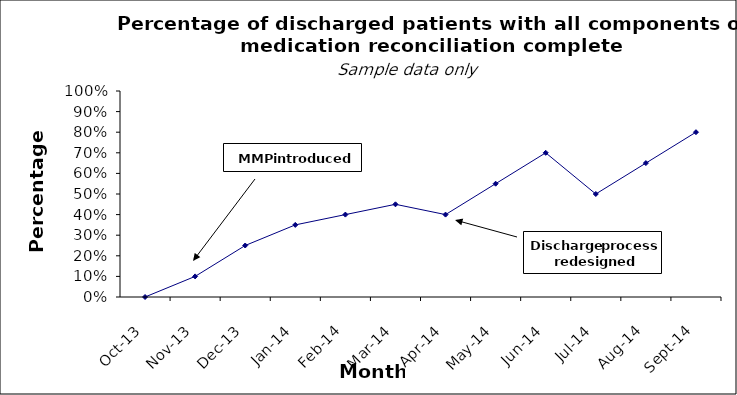
| Category | Series 1 |
|---|---|
| 2013-10-01 | 0 |
| 2013-11-01 | 0.1 |
| 2013-12-01 | 0.25 |
| 2014-01-01 | 0.35 |
| 2014-02-01 | 0.4 |
| 2014-03-01 | 0.45 |
| 2014-04-01 | 0.4 |
| 2014-05-01 | 0.55 |
| 2014-06-01 | 0.7 |
| 2014-07-01 | 0.5 |
| 2014-08-01 | 0.65 |
| 2014-09-01 | 0.8 |